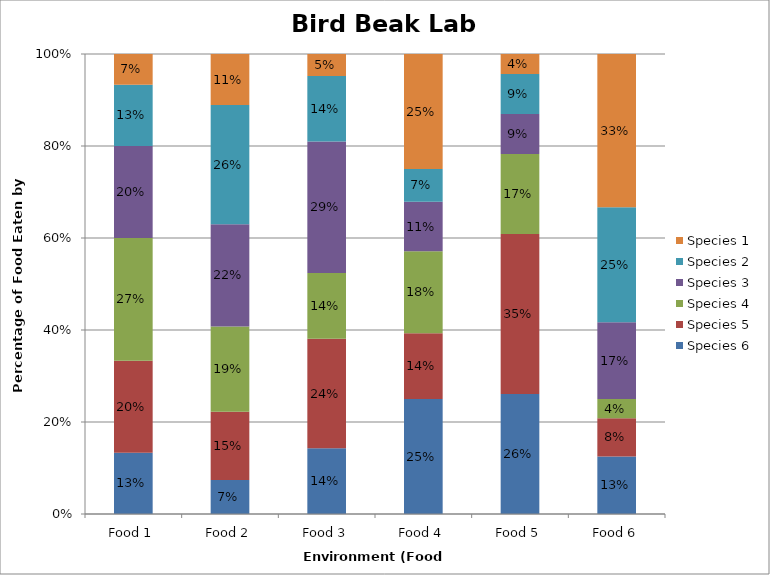
| Category | Species 6 | Species 5 | Species 4 | Species 3 | Species 2 | Species 1 |
|---|---|---|---|---|---|---|
| Food 1 | 0.133 | 0.2 | 0.267 | 0.2 | 0.133 | 0.067 |
| Food 2 | 0.074 | 0.148 | 0.185 | 0.222 | 0.259 | 0.111 |
| Food 3 | 0.143 | 0.238 | 0.143 | 0.286 | 0.143 | 0.048 |
| Food 4 | 0.25 | 0.143 | 0.179 | 0.107 | 0.071 | 0.25 |
| Food 5 | 0.261 | 0.348 | 0.174 | 0.087 | 0.087 | 0.043 |
| Food 6 | 0.125 | 0.083 | 0.042 | 0.167 | 0.25 | 0.333 |